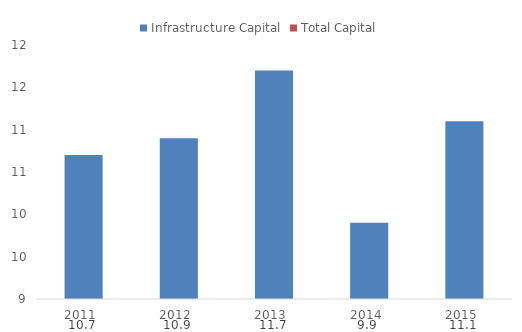
| Category | Infrastructure Capital | Total Capital |
|---|---|---|
| 2011.0 | 10.7 | 0 |
| 2012.0 | 10.9 | 0 |
| 2013.0 | 11.7 | 0 |
| 2014.0 | 9.9 | 0 |
| 2015.0 | 11.1 | 0 |